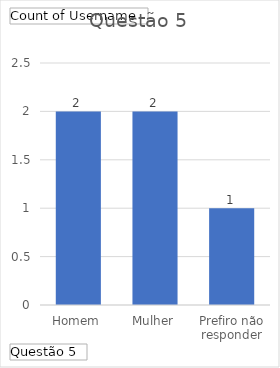
| Category | Total |
|---|---|
| Homem | 2 |
| Mulher | 2 |
| Prefiro não responder | 1 |